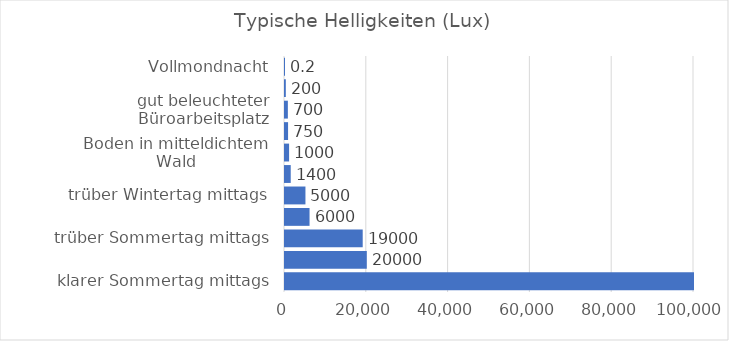
| Category | Series 0 |
|---|---|
| klarer Sommertag mittags | 100000 |
| klarer Wintertag mittags | 20000 |
| trüber Sommertag mittags | 19000 |
| Schatten unter einem Gartentisch  | 6000 |
| trüber Wintertag mittags | 5000 |
| Fußballstadion höchste UEFA Kategorie | 1400 |
| Boden in mitteldichtem Wald | 1000 |
| Dämmerung | 750 |
| gut beleuchteter Büroarbeitsplatz | 700 |
| typisches Wohnzimmer | 200 |
| Vollmondnacht | 0.2 |